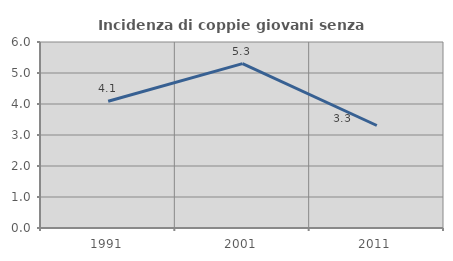
| Category | Incidenza di coppie giovani senza figli |
|---|---|
| 1991.0 | 4.089 |
| 2001.0 | 5.301 |
| 2011.0 | 3.307 |